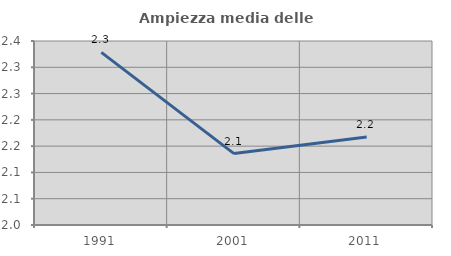
| Category | Ampiezza media delle famiglie |
|---|---|
| 1991.0 | 2.328 |
| 2001.0 | 2.136 |
| 2011.0 | 2.168 |